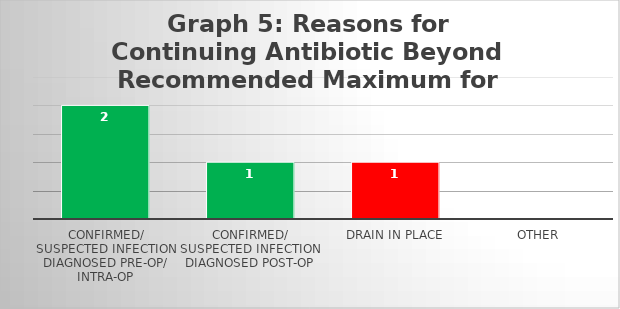
| Category | Series 0 |
|---|---|
| Confirmed/ Suspected infection diagnosed pre-op/ intra-op | 2 |
| Confirmed/ Suspected infection diagnosed post-op | 1 |
| Drain in place | 1 |
| Other | 0 |